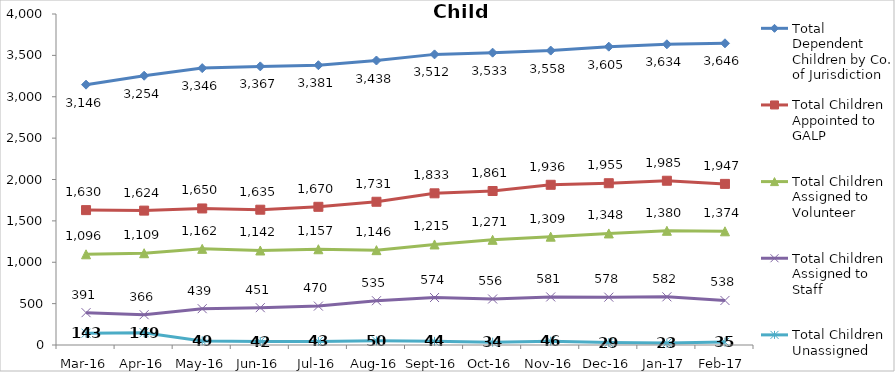
| Category | Total Dependent Children by Co. of Jurisdiction | Total Children Appointed to GALP | Total Children Assigned to Volunteer | Total Children Assigned to Staff | Total Children Unassigned |
|---|---|---|---|---|---|
| Mar-16 | 3146 | 1630 | 1096 | 391 | 143 |
| Apr-16 | 3254 | 1624 | 1109 | 366 | 149 |
| May-16 | 3346 | 1650 | 1162 | 439 | 49 |
| Jun-16 | 3367 | 1635 | 1142 | 451 | 42 |
| Jul-16 | 3381 | 1670 | 1157 | 470 | 43 |
| Aug-16 | 3438 | 1731 | 1146 | 535 | 50 |
| Sep-16 | 3512 | 1833 | 1215 | 574 | 44 |
| Oct-16 | 3533 | 1861 | 1271 | 556 | 34 |
| Nov-16 | 3558 | 1936 | 1309 | 581 | 46 |
| Dec-16 | 3605 | 1955 | 1348 | 578 | 29 |
| Jan-17 | 3634 | 1985 | 1380 | 582 | 23 |
| Feb-17 | 3646 | 1947 | 1374 | 538 | 35 |